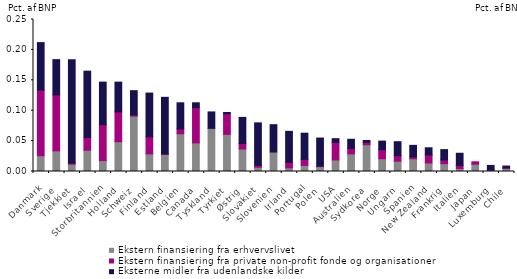
| Category | Ekstern finansiering fra erhvervslivet | Ekstern finansiering fra private non-profit fonde og organisationer | Eksterne midler fra udenlandske kilder |
|---|---|---|---|
| Danmark | 0.026 | 0.108 | 0.078 |
| Sverige | 0.034 | 0.092 | 0.058 |
| Tjekkiet | 0.012 | 0.002 | 0.17 |
| Israel | 0.035 | 0.021 | 0.109 |
| Storbritannien | 0.018 | 0.059 | 0.07 |
| Holland | 0.049 | 0.049 | 0.049 |
| Schweiz | 0.091 | 0.002 | 0.04 |
| Finland | 0.029 | 0.028 | 0.072 |
| Estland | 0.028 | 0.001 | 0.093 |
| Belgien | 0.062 | 0.008 | 0.043 |
| Canada | 0.047 | 0.058 | 0.008 |
| Tyskland | 0.071 | 0 | 0.027 |
| Tyrkiet | 0.061 | 0.034 | 0.002 |
| Østrig | 0.037 | 0.009 | 0.043 |
| Slovakiet | 0.007 | 0.003 | 0.07 |
| Slovenien | 0.032 | 0 | 0.045 |
| Irland | 0.006 | 0.009 | 0.051 |
| Portugal | 0.01 | 0.01 | 0.043 |
| Polen | 0.008 | 0.001 | 0.046 |
| USA | 0.019 | 0.029 | 0.006 |
| Australien | 0.029 | 0.009 | 0.015 |
| Sydkorea | 0.044 | 0.004 | 0.003 |
| Norge | 0.021 | 0.015 | 0.014 |
| Ungarn | 0.017 | 0.009 | 0.023 |
| Spanien | 0.021 | 0.003 | 0.019 |
| New Zealand | 0.014 | 0.013 | 0.012 |
| Frankrig | 0.013 | 0.006 | 0.017 |
| Italien | 0.005 | 0.005 | 0.02 |
| Japan | 0.012 | 0.004 | 0 |
| Luxemburg | 0.002 | 0.001 | 0.007 |
| Chile | 0.005 | 0.001 | 0.003 |